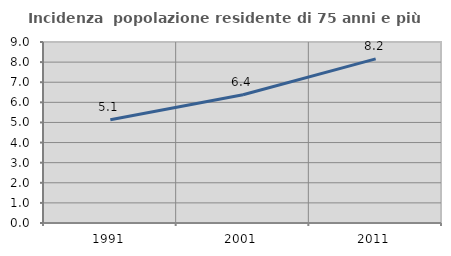
| Category | Incidenza  popolazione residente di 75 anni e più |
|---|---|
| 1991.0 | 5.136 |
| 2001.0 | 6.374 |
| 2011.0 | 8.16 |